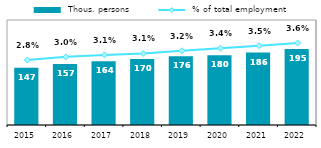
| Category |  Thous. persons |
|---|---|
| 2015 | 147.389 |
| 2016 | 157.142 |
| 2017 | 164.209 |
| 2018 | 169.722 |
| 2019 | 176.484 |
| 2020 | 179.562 |
| 2021 | 186.17 |
| 2022 | 195.495 |